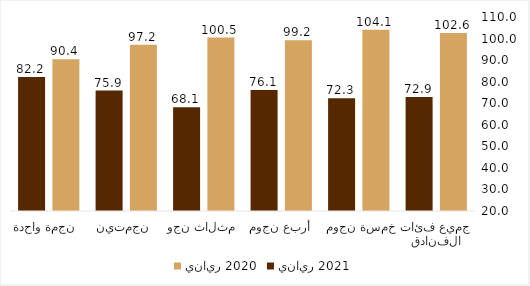
| Category | يناير 2020 | يناير 2021 |
|---|---|---|
| جميع فئات الفنادق | 102.625 | 72.886 |
|  خمسة نجوم  | 104.065 | 72.318 |
| أربع نجوم | 99.242 | 76.09 |
| ثلاث نجوم  | 100.467 | 68.078 |
| نجمتين  | 97.176 | 75.887 |
| نجمة واحدة  | 90.449 | 82.22 |